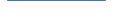
| Category | Series 0 |
|---|---|
| 0 | 31 |
| 1 | 29 |
| 2 | 23 |
| 3 | 22 |
| 4 | 18 |
| 5 | 18 |
| 6 | 12 |
| 7 | 13 |
| 8 | 10 |